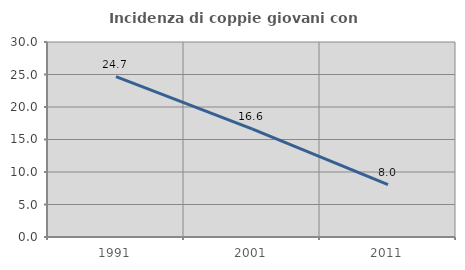
| Category | Incidenza di coppie giovani con figli |
|---|---|
| 1991.0 | 24.671 |
| 2001.0 | 16.646 |
| 2011.0 | 8.044 |